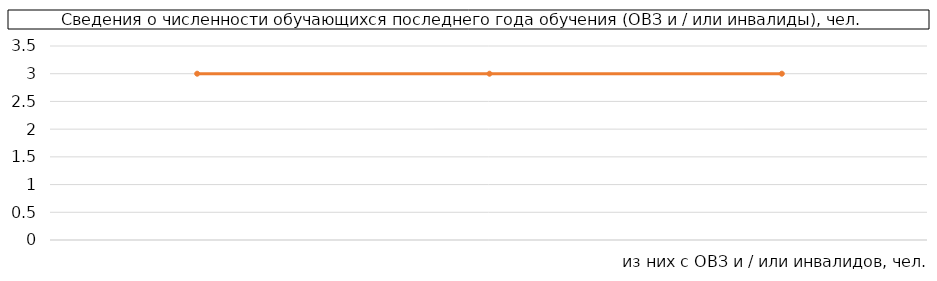
| Category | Series 1 |
|---|---|
| из них с ОВЗ и / или инвалидов, чел. | 3 |
| из них с ОВЗ и / или инвалидов, чел. | 3 |
| Из них с ОВЗ и / или инвалидов, чел. | 3 |